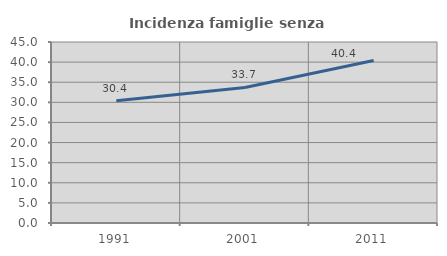
| Category | Incidenza famiglie senza nuclei |
|---|---|
| 1991.0 | 30.384 |
| 2001.0 | 33.709 |
| 2011.0 | 40.383 |